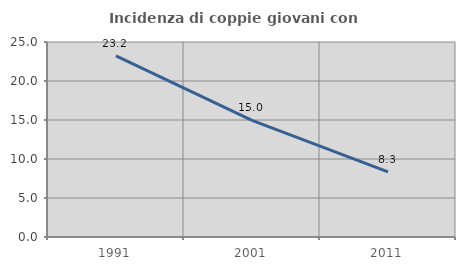
| Category | Incidenza di coppie giovani con figli |
|---|---|
| 1991.0 | 23.222 |
| 2001.0 | 14.957 |
| 2011.0 | 8.348 |